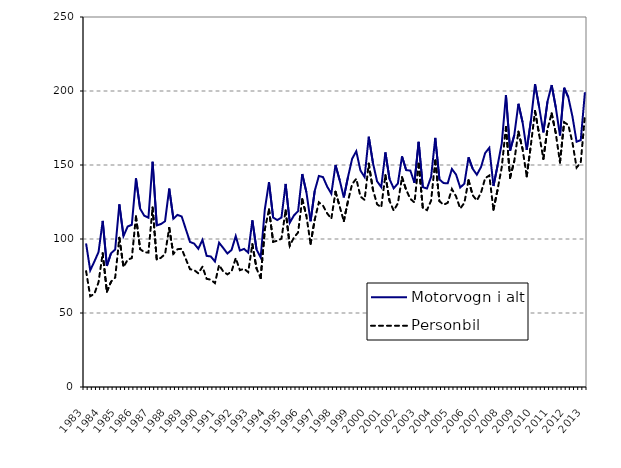
| Category | Motorvogn i alt | Personbil |
|---|---|---|
| 1983.0 | 97 | 78.3 |
| nan | 78.8 | 61.3 |
| nan | 84.8 | 63 |
| nan | 91.2 | 70.8 |
| 1984.0 | 112.2 | 90.4 |
| nan | 81.8 | 64.4 |
| nan | 90.4 | 71.1 |
| nan | 92.9 | 73.9 |
| 1985.0 | 123.4 | 100.8 |
| nan | 102 | 81.1 |
| nan | 108.4 | 86 |
| nan | 109.6 | 87.1 |
| 1986.0 | 141 | 115.2 |
| nan | 120.5 | 93.2 |
| nan | 115.7 | 91.1 |
| nan | 114.4 | 90.8 |
| 1987.0 | 152.2 | 121.3 |
| nan | 109.2 | 86.1 |
| nan | 110.1 | 87.3 |
| nan | 112 | 89.8 |
| 1988.0 | 134.1 | 107.5 |
| nan | 113.7 | 90 |
| nan | 116.3 | 93.1 |
| nan | 115.2 | 93.4 |
| 1989.0 | 106.6 | 86.4 |
| nan | 98 | 79.6 |
| nan | 96.9 | 79 |
| nan | 93.4 | 76.8 |
| 1990.0 | 99.4 | 81.3 |
| nan | 88.6 | 73.1 |
| nan | 88.2 | 72.5 |
| nan | 84.8 | 70.2 |
| 1991.0 | 97.5 | 82.4 |
| nan | 93.9 | 78 |
| nan | 90.2 | 76.1 |
| nan | 92.6 | 78.1 |
| 1992.0 | 102 | 87.1 |
| nan | 92.2 | 78.9 |
| nan | 93.3 | 79.9 |
| nan | 90.8 | 77.6 |
| 1993.0 | 112.6 | 96.5 |
| nan | 93 | 80.1 |
| nan | 87.5 | 73.6 |
| nan | 120.1 | 106.6 |
| 1994.0 | 138.4 | 120 |
| nan | 114.5 | 98.1 |
| nan | 112.8 | 98.8 |
| nan | 114.5 | 100.2 |
| 1995.0 | 137.2 | 119.3 |
| nan | 111 | 95.4 |
| nan | 115.9 | 101 |
| nan | 118.8 | 104.4 |
| 1996.0 | 143.9 | 126.9 |
| nan | 131.6 | 115.7 |
| nan | 112 | 96.7 |
| nan | 132.5 | 113.1 |
| 1997.0 | 142.6 | 124.8 |
| nan | 141.8 | 122.5 |
| nan | 135.4 | 117.3 |
| nan | 130.6 | 113.7 |
| 1998.0 | 150 | 131.9 |
| nan | 139.8 | 122 |
| nan | 128.1 | 112.1 |
| nan | 141.8 | 125.6 |
| 1999.0 | 154.2 | 137.1 |
| nan | 159.3 | 140.7 |
| nan | 146.3 | 128.7 |
| nan | 141.9 | 126.4 |
| 2000.0 | 169.1 | 150.9 |
| nan | 151.5 | 133.4 |
| nan | 139 | 123.5 |
| nan | 135.1 | 121.4 |
| 2001.0 | 158.5 | 143.1 |
| nan | 140.46 | 125.7 |
| nan | 134.24 | 119.2 |
| nan | 137.495 | 124.072 |
| 2002.0 | 155.814 | 141.724 |
| nan | 146.543 | 133.19 |
| nan | 146.231 | 127.141 |
| nan | 137.967 | 124.641 |
| 2003.0 | 165.679 | 150.811 |
| nan | 135.021 | 121.101 |
| nan | 134.111 | 119.491 |
| nan | 142.013 | 125.959 |
| 2004.0 | 168.309 | 153.043 |
| nan | 140.267 | 125.568 |
| nan | 137.77 | 123.121 |
| nan | 137.685 | 124.506 |
| 2005.0 | 147.311 | 133.756 |
| nan | 143.517 | 128.79 |
| nan | 134.783 | 120.571 |
| nan | 137.37 | 124.382 |
| 2006.0 | 155.213 | 139.728 |
| nan | 147.444 | 129.572 |
| nan | 143.451 | 126.006 |
| nan | 148.561 | 131.195 |
| 2007.0 | 158.1 | 141.084 |
| nan | 161.613 | 142.897 |
| nan | 135.821 | 119.753 |
| nan | 149.791 | 133.498 |
| 2008.0 | 164.642 | 148.614 |
| nan | 197.287 | 175.714 |
| nan | 159.718 | 141.407 |
| nan | 170.057 | 152.54 |
| 2009.0 | 191.38 | 172.559 |
| nan | 178.906 | 160.765 |
| nan | 160.234 | 142.312 |
| nan | 179.857 | 163.532 |
| 2010.0 | 204.636 | 186.507 |
| nan | 188.957 | 170.463 |
| nan | 172.077 | 154.156 |
| nan | 192.961 | 174.399 |
| 2011.0 | 204.005 | 184.86 |
| nan | 188.741 | 171.333 |
| nan | 169.934 | 151.694 |
| nan | 202.176 | 178.919 |
| 2012.0 | 195.829 | 177.072 |
| nan | 182.751 | 165.128 |
| nan | 165.73 | 148.242 |
| nan | 166.805 | 151.728 |
| 2013.0 | 199.181 | 183.653 |